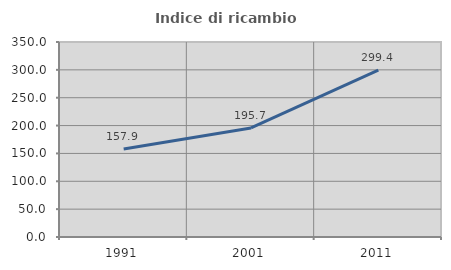
| Category | Indice di ricambio occupazionale  |
|---|---|
| 1991.0 | 157.944 |
| 2001.0 | 195.745 |
| 2011.0 | 299.425 |